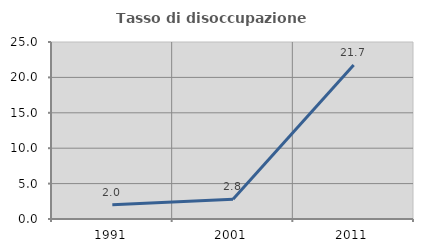
| Category | Tasso di disoccupazione giovanile  |
|---|---|
| 1991.0 | 2 |
| 2001.0 | 2.778 |
| 2011.0 | 21.739 |